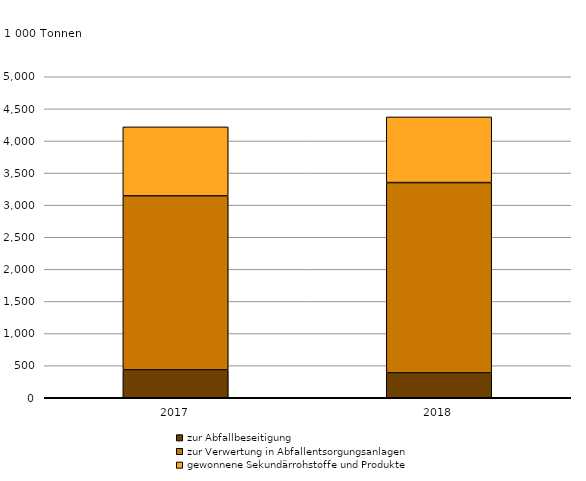
| Category | zur Abfallbeseitigung | zur Verwertung in Abfallentsorgungsanlagen | gewonnene Sekundärrohstoffe und Produkte |
|---|---|---|---|
| 2017.0 | 433640 | 2710409 | 1075606 |
| 2018.0 | 387159 | 2964581 | 1022658 |